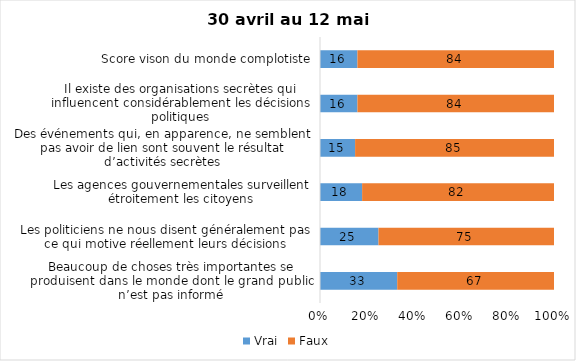
| Category | Vrai | Faux |
|---|---|---|
| Beaucoup de choses très importantes se produisent dans le monde dont le grand public n’est pas informé | 33 | 67 |
| Les politiciens ne nous disent généralement pas ce qui motive réellement leurs décisions | 25 | 75 |
| Les agences gouvernementales surveillent étroitement les citoyens | 18 | 82 |
| Des événements qui, en apparence, ne semblent pas avoir de lien sont souvent le résultat d’activités secrètes | 15 | 85 |
| Il existe des organisations secrètes qui influencent considérablement les décisions politiques | 16 | 84 |
| Score vison du monde complotiste | 16 | 84 |